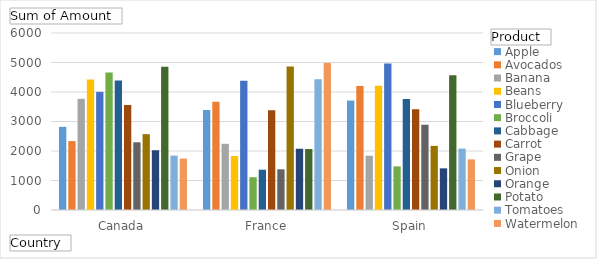
| Category | Apple | Avocados | Banana | Beans | Blueberry | Broccoli | Cabbage | Carrot | Grape | Onion | Orange | Potato | Tomatoes | Watermelon |
|---|---|---|---|---|---|---|---|---|---|---|---|---|---|---|
| Canada | 2818 | 2335 | 3769 | 4421 | 4004 | 4658 | 4389 | 3558 | 2295 | 2571 | 2025 | 4857 | 1844 | 1742 |
| France | 3389 | 3669 | 2244 | 1830 | 4383 | 1111 | 1366 | 3382 | 1379 | 4866 | 2076 | 2066 | 4432 | 4985 |
| Spain | 3709 | 4206 | 1839 | 4212 | 4964 | 1478 | 3762 | 3412 | 2890 | 2174 | 1412 | 4572 | 2082 | 1716 |